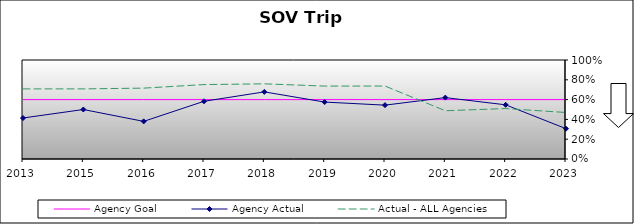
| Category | Agency Goal | Agency Actual | Actual - ALL Agencies |
|---|---|---|---|
| 2013.0 | 0.6 | 0.414 | 0.708 |
| 2015.0 | 0.6 | 0.5 | 0.708 |
| 2016.0 | 0.6 | 0.38 | 0.716 |
| 2017.0 | 0.6 | 0.583 | 0.752 |
| 2018.0 | 0.6 | 0.678 | 0.759 |
| 2019.0 | 0.6 | 0.575 | 0.736 |
| 2020.0 | 0.6 | 0.544 | 0.737 |
| 2021.0 | 0.6 | 0.62 | 0.487 |
| 2022.0 | 0.6 | 0.547 | 0.509 |
| 2023.0 | 0.6 | 0.306 | 0.47 |